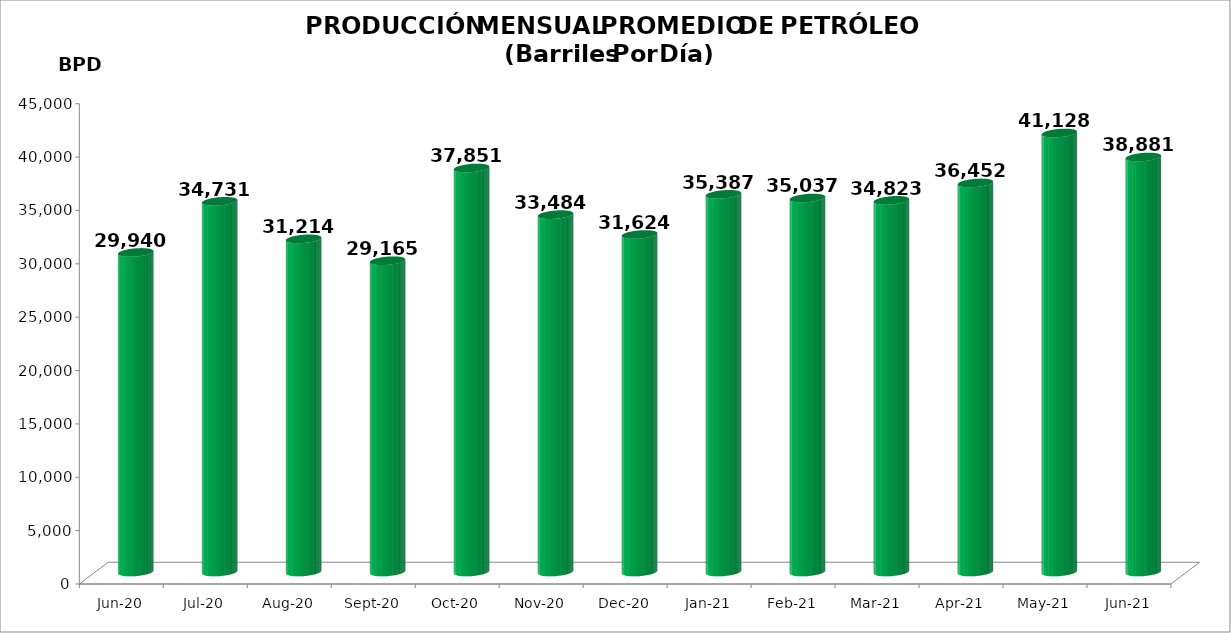
| Category | Series 0 |
|---|---|
| 2020-06-01 | 29940 |
| 2020-07-01 | 34731 |
| 2020-08-01 | 31214 |
| 2020-09-01 | 29165 |
| 2020-10-01 | 37851 |
| 2020-11-01 | 33484 |
| 2020-12-01 | 31624 |
| 2021-01-01 | 35387 |
| 2021-02-01 | 35037 |
| 2021-03-01 | 34823 |
| 2021-04-01 | 36452 |
| 2021-05-01 | 41128.032 |
| 2021-06-01 | 38881.4 |